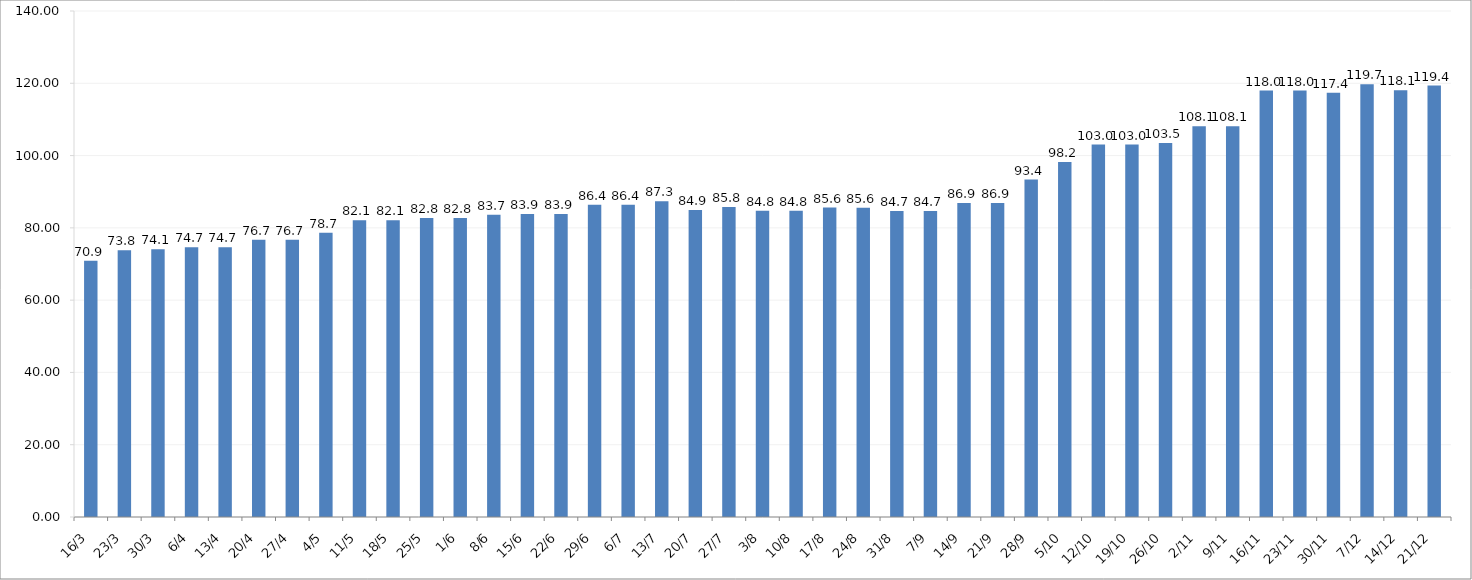
| Category | Series 0 |
|---|---|
| 2020-03-16 | 70.917 |
| 2020-03-23 | 73.833 |
| 2020-03-30 | 74.083 |
| 2020-04-06 | 74.667 |
| 2020-04-13 | 74.667 |
| 2020-04-20 | 76.7 |
| 2020-04-27 | 76.7 |
| 2020-05-04 | 78.658 |
| 2020-05-11 | 82.075 |
| 2020-05-18 | 82.075 |
| 2020-05-25 | 82.758 |
| 2020-06-01 | 82.758 |
| 2020-06-08 | 83.658 |
| 2020-06-15 | 83.85 |
| 2020-06-22 | 83.85 |
| 2020-06-29 | 86.408 |
| 2020-07-06 | 86.408 |
| 2020-07-13 | 87.342 |
| 2020-07-20 | 84.925 |
| 2020-07-27 | 85.767 |
| 2020-08-03 | 84.758 |
| 2020-08-10 | 84.758 |
| 2020-08-17 | 85.6 |
| 2020-08-24 | 85.592 |
| 2020-08-31 | 84.675 |
| 2020-09-07 | 84.675 |
| 2020-09-14 | 86.875 |
| 2020-09-21 | 86.875 |
| 2020-09-28 | 93.375 |
| 2020-10-05 | 98.208 |
| 2020-10-12 | 103.042 |
| 2020-10-19 | 103.042 |
| 2020-10-26 | 103.458 |
| 2020-11-02 | 108.125 |
| 2020-11-09 | 108.125 |
| 2020-11-16 | 118 |
| 2020-11-23 | 118 |
| 2020-11-30 | 117.35 |
| 2020-12-07 | 119.7 |
| 2020-12-14 | 118.075 |
| 2020-12-21 | 119.367 |